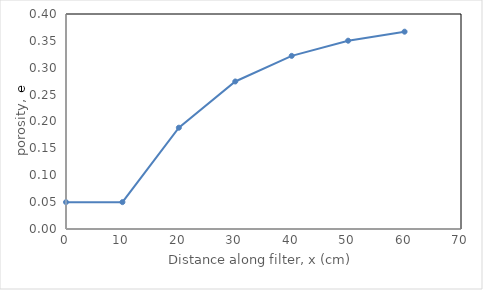
| Category | Series 0 |
|---|---|
| 0.0 | 0.05 |
| 10.0 | 0.05 |
| 20.0 | 0.188 |
| 30.0 | 0.274 |
| 40.0 | 0.322 |
| 50.0 | 0.35 |
| 60.0 | 0.367 |